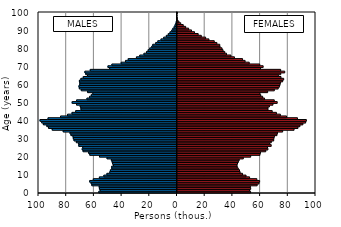
| Category | -5 176 927  | 5 361 348  |
|---|---|---|
| 0.0 | -56454 | 53489 |
| 1.0 | -55476 | 52797 |
| 2.0 | -56018 | 53573 |
| 3.0 | -56192 | 53328 |
| 4.0 | -61500 | 58242 |
| 5.0 | -61979 | 59536 |
| 6.0 | -63038 | 60008 |
| 7.0 | -60443 | 58030 |
| 8.0 | -56044 | 52779 |
| 9.0 | -52824 | 50223 |
| 10.0 | -50619 | 47687 |
| 11.0 | -48527 | 45927 |
| 12.0 | -48094 | 45494 |
| 13.0 | -47105 | 44594 |
| 14.0 | -47152 | 43873 |
| 15.0 | -45917 | 43689 |
| 16.0 | -46476 | 44050 |
| 17.0 | -46864 | 44656 |
| 18.0 | -47384 | 45274 |
| 19.0 | -50523 | 48250 |
| 20.0 | -55968 | 53573 |
| 21.0 | -62992 | 60275 |
| 22.0 | -63806 | 60657 |
| 23.0 | -67827 | 64448 |
| 24.0 | -68441 | 66002 |
| 25.0 | -68034 | 65666 |
| 26.0 | -70923 | 68379 |
| 27.0 | -71013 | 67273 |
| 28.0 | -72679 | 68443 |
| 29.0 | -74352 | 70177 |
| 30.0 | -74856 | 70308 |
| 31.0 | -75088 | 70670 |
| 32.0 | -76571 | 72534 |
| 33.0 | -77230 | 72931 |
| 34.0 | -82166 | 76648 |
| 35.0 | -90105 | 84885 |
| 36.0 | -92746 | 87714 |
| 37.0 | -93978 | 89134 |
| 38.0 | -96485 | 91264 |
| 39.0 | -97684 | 93235 |
| 40.0 | -98937 | 93763 |
| 41.0 | -93133 | 87342 |
| 42.0 | -84088 | 79453 |
| 43.0 | -79044 | 75005 |
| 44.0 | -75813 | 72151 |
| 45.0 | -73154 | 69098 |
| 46.0 | -69315 | 66058 |
| 47.0 | -69452 | 66081 |
| 48.0 | -69881 | 67094 |
| 49.0 | -72517 | 69640 |
| 50.0 | -75703 | 72721 |
| 51.0 | -72464 | 70587 |
| 52.0 | -65044 | 63579 |
| 53.0 | -63107 | 62200 |
| 54.0 | -61895 | 60793 |
| 55.0 | -60770 | 60237 |
| 56.0 | -64547 | 65814 |
| 57.0 | -69100 | 70641 |
| 58.0 | -70510 | 73412 |
| 59.0 | -70819 | 74264 |
| 60.0 | -70234 | 74766 |
| 61.0 | -70220 | 75056 |
| 62.0 | -70464 | 76643 |
| 63.0 | -69413 | 77392 |
| 64.0 | -67705 | 75462 |
| 65.0 | -64579 | 73543 |
| 66.0 | -65883 | 75266 |
| 67.0 | -66513 | 78140 |
| 68.0 | -62637 | 75199 |
| 69.0 | -48587 | 60704 |
| 70.0 | -49860 | 62566 |
| 71.0 | -47031 | 60117 |
| 72.0 | -40304 | 52516 |
| 73.0 | -37216 | 49515 |
| 74.0 | -35227 | 47691 |
| 75.0 | -29293 | 41827 |
| 76.0 | -26905 | 39282 |
| 77.0 | -23869 | 36122 |
| 78.0 | -22040 | 34819 |
| 79.0 | -20850 | 33607 |
| 80.0 | -19686 | 32883 |
| 81.0 | -18228 | 31452 |
| 82.0 | -17509 | 31231 |
| 83.0 | -15372 | 29141 |
| 84.0 | -13834 | 27263 |
| 85.0 | -11573 | 23437 |
| 86.0 | -9609 | 21045 |
| 87.0 | -7699 | 17898 |
| 88.0 | -6290 | 15638 |
| 89.0 | -5045 | 13025 |
| 90.0 | -3795 | 10842 |
| 91.0 | -3031 | 8772 |
| 92.0 | -2076 | 6621 |
| 93.0 | -1453 | 4855 |
| 94.0 | -867 | 3062 |
| 95.0 | -510 | 1764 |
| 96.0 | -196 | 708 |
| 97.0 | -129 | 555 |
| 98.0 | -96 | 356 |
| 99.0 | -60 | 294 |
| 100.0 | -173 | 625 |